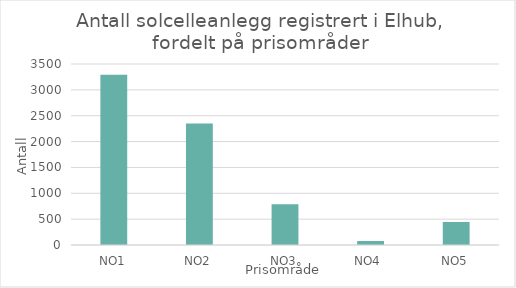
| Category | Antall anlegg |
|---|---|
| NO1 | 3290 |
| NO2 | 2348 |
| NO3 | 786 |
| NO4  | 77 |
| NO5 | 445 |